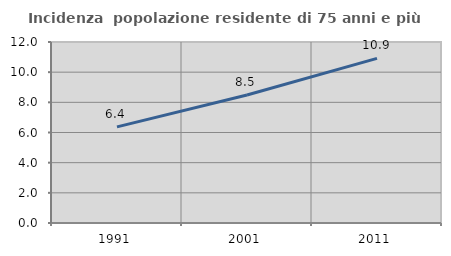
| Category | Incidenza  popolazione residente di 75 anni e più |
|---|---|
| 1991.0 | 6.372 |
| 2001.0 | 8.485 |
| 2011.0 | 10.915 |